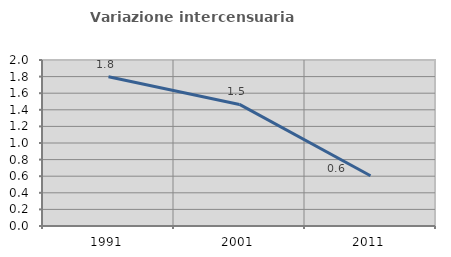
| Category | Variazione intercensuaria annua |
|---|---|
| 1991.0 | 1.799 |
| 2001.0 | 1.465 |
| 2011.0 | 0.606 |